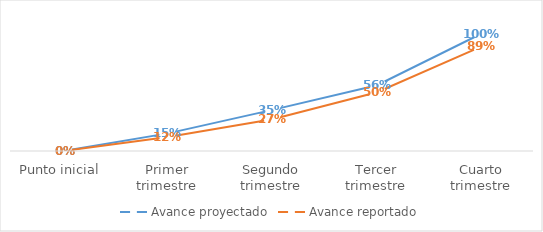
| Category | Avance proyectado | Avance reportado |
|---|---|---|
| Punto inicial | 0 | 0 |
| Primer trimestre | 0.15 | 0.12 |
| Segundo trimestre | 0.35 | 0.27 |
| Tercer trimestre | 0.56 | 0.5 |
| Cuarto trimestre | 1 | 0.89 |